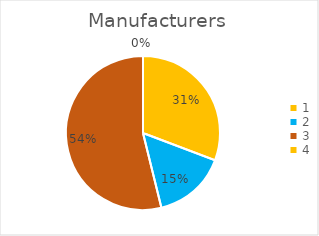
| Category | Series 0 |
|---|---|
| 0 | 0.308 |
| 1 | 0.154 |
| 2 | 0.538 |
| 3 | 0 |